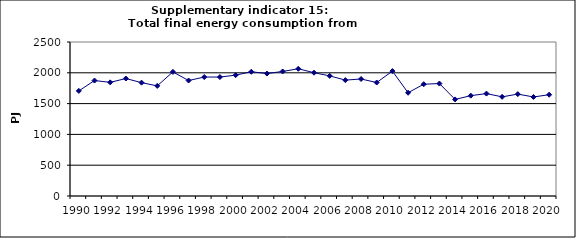
| Category | Total final energy consumption from households, PJ |
|---|---|
| 1990 | 1706.351 |
| 1991 | 1874.334 |
| 1992 | 1844.968 |
| 1993 | 1907.029 |
| 1994 | 1839.956 |
| 1995 | 1787.374 |
| 1996 | 2014.683 |
| 1997 | 1874.656 |
| 1998 | 1931.199 |
| 1999 | 1930.987 |
| 2000 | 1961.565 |
| 2001 | 2017.13 |
| 2002 | 1987.5 |
| 2003 | 2021.932 |
| 2004 | 2065.466 |
| 2005 | 2001.517 |
| 2006 | 1950.008 |
| 2007 | 1881.231 |
| 2008 | 1899.475 |
| 2009 | 1842.065 |
| 2010 | 2027.536 |
| 2011 | 1676.23 |
| 2012 | 1814.83 |
| 2013 | 1825.321 |
| 2014 | 1567.74 |
| 2015 | 1628.935 |
| 2016 | 1662.688 |
| 2017 | 1609.64 |
| 2018 | 1654.091 |
| 2019 | 1607.523 |
| 2020 | 1644.403 |